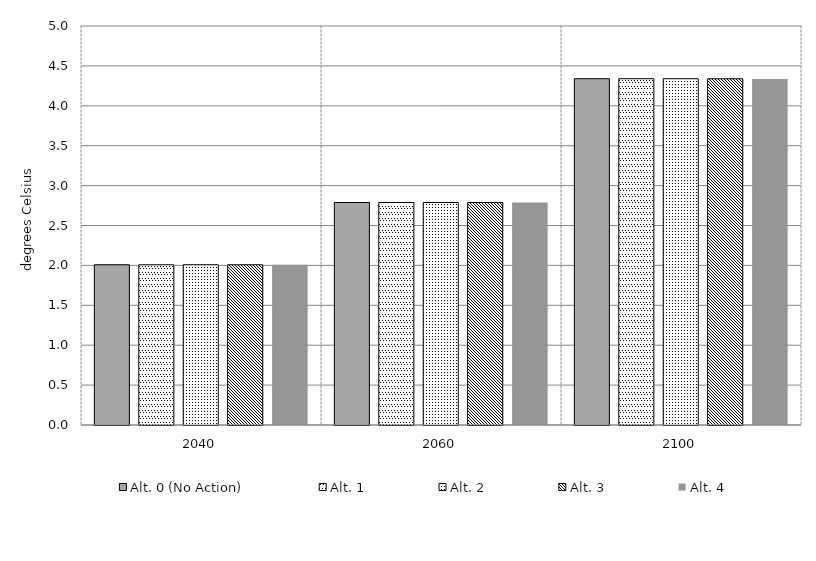
| Category | Alt. 0 (No Action) | Alt. 1 | Alt. 2 | Alt. 3 | Alt. 4 | Alt 5 | Alt 6 | Alt 7 | Alt 8 | Alt 10 |
|---|---|---|---|---|---|---|---|---|---|---|
| 2040.0 | 2.008 | 2.008 | 2.008 | 2.008 | 2.007 |  |  |  |  |  |
| 2060.0 | 2.788 | 2.788 | 2.788 | 2.788 | 2.787 |  |  |  |  |  |
| 2100.0 | 4.34 | 4.34 | 4.339 | 4.339 | 4.337 |  |  |  |  |  |